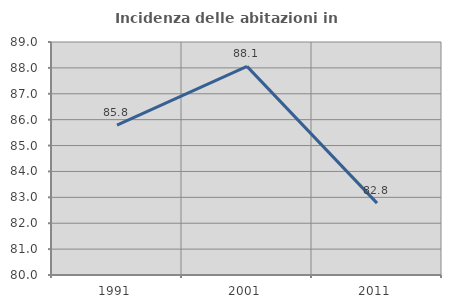
| Category | Incidenza delle abitazioni in proprietà  |
|---|---|
| 1991.0 | 85.789 |
| 2001.0 | 88.06 |
| 2011.0 | 82.775 |